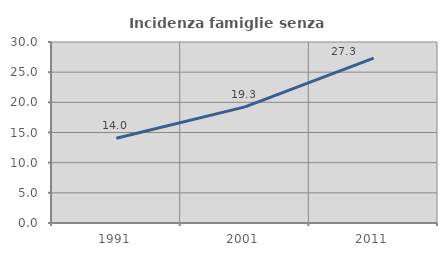
| Category | Incidenza famiglie senza nuclei |
|---|---|
| 1991.0 | 14.034 |
| 2001.0 | 19.251 |
| 2011.0 | 27.321 |